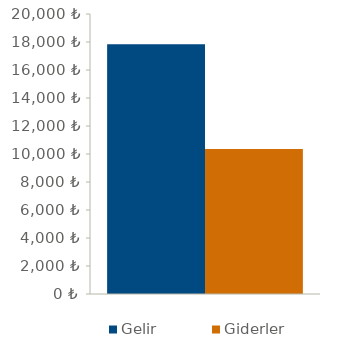
| Category | Gelir | Giderler |
|---|---|---|
| 0 | 17839 | 10364 |